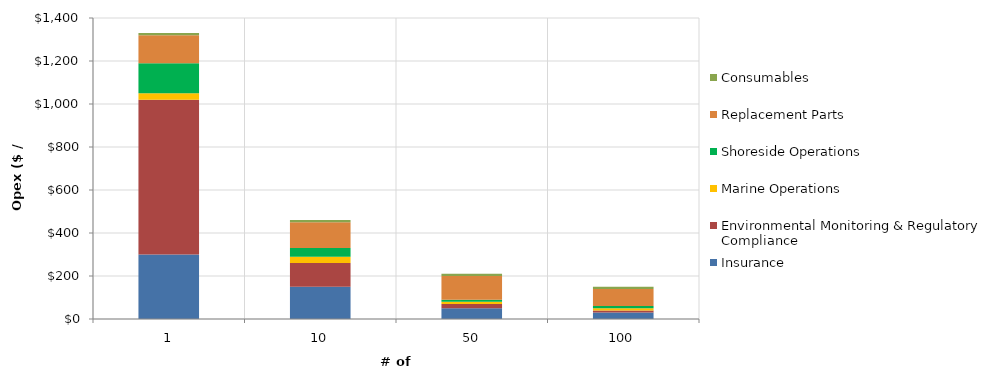
| Category | Insurance | Environmental Monitoring & Regulatory Compliance | Marine Operations | Shoreside Operations | Replacement Parts | Consumables |
|---|---|---|---|---|---|---|
| 1.0 | 300 | 720 | 30 | 140 | 130 | 10 |
| 10.0 | 150 | 110 | 30 | 40 | 120 | 10 |
| 50.0 | 50 | 20 | 10 | 10 | 110 | 10 |
| 100.0 | 30 | 10 | 10 | 10 | 80 | 10 |